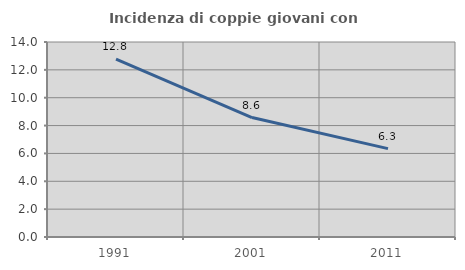
| Category | Incidenza di coppie giovani con figli |
|---|---|
| 1991.0 | 12.769 |
| 2001.0 | 8.577 |
| 2011.0 | 6.343 |